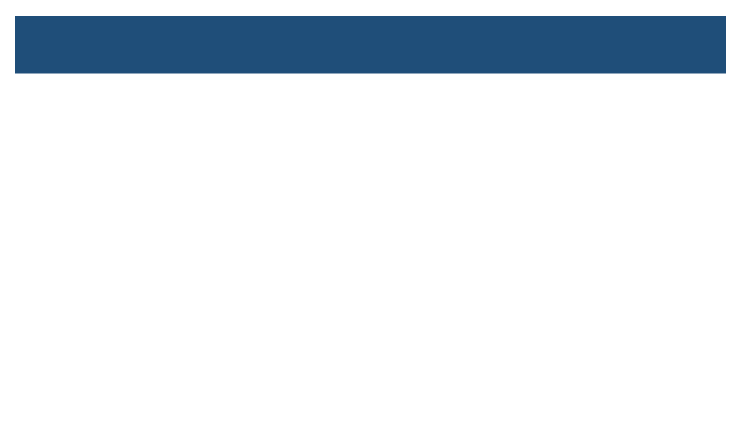
| Category | Series 0 | Series 1 | Series 2 |
|---|---|---|---|
| 0.0 | 0 | 562.448 | 3450.712 |
| 10.0 | 0 | 562.448 | 3450.712 |
| 90.0 | 0 | 562.448 | 3450.712 |
| 100.0 | 0 | 562.448 | 3450.712 |